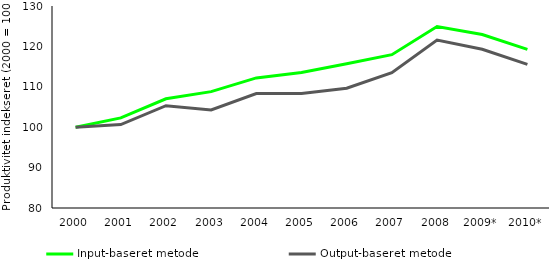
| Category | Input-baseret metode | Output-baseret metode |
|---|---|---|
| 2000 | 100 | 100 |
| 2001 | 102.294 | 100.665 |
| 2002 | 107.03 | 105.332 |
| 2003 | 108.799 | 104.261 |
| 2004 | 112.198 | 108.337 |
| 2005 | 113.54 | 108.326 |
| 2006 | 115.685 | 109.652 |
| 2007 | 117.957 | 113.514 |
| 2008 | 124.914 | 121.578 |
| 2009* | 122.944 | 119.306 |
| 2010* | 119.278 | 115.555 |